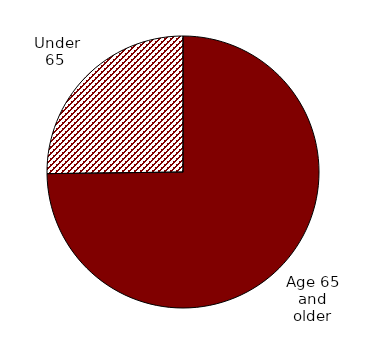
| Category | Series 0 |
|---|---|
| Age 65 and older | 5027 |
| Under 65  | 1693 |